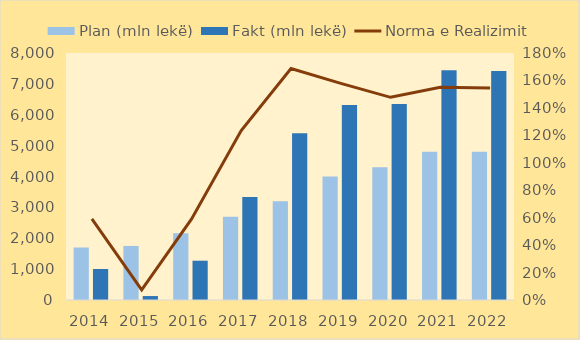
| Category | Plan (mln lekë) | Fakt (mln lekë) |
|---|---|---|
| 2014.0 | 1700.4 | 1004.843 |
| 2015.0 | 1750.75 | 128.325 |
| 2016.0 | 2160 | 1272.832 |
| 2017.0 | 2700 | 3334.883 |
| 2018.0 | 3200 | 5398.329 |
| 2019.0 | 4000 | 6315.307 |
| 2020.0 | 4300 | 6350.959 |
| 2021.0 | 4800 | 7438.142 |
| 2022.0 | 4800 | 7414.036 |